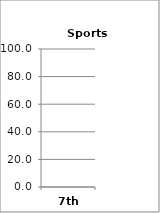
| Category | Sports (Choices) |
|---|---|
| 7th | 0 |